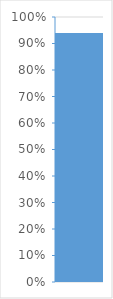
| Category | Series 0 |
|---|---|
| 0 | 0.94 |